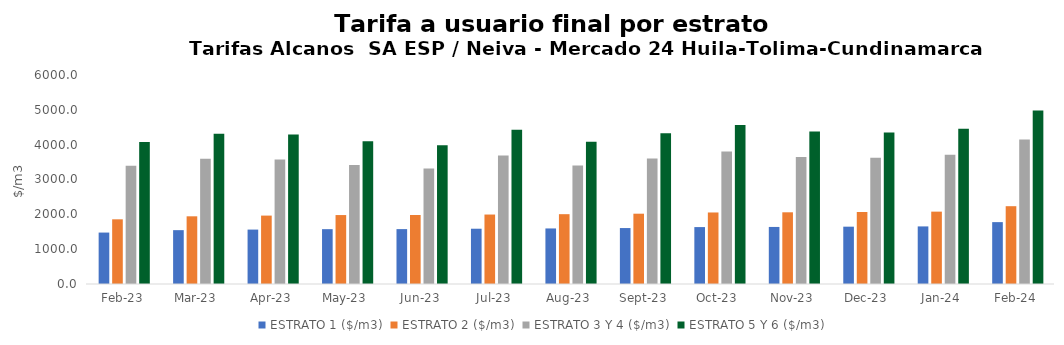
| Category | ESTRATO 1 ($/m3) | ESTRATO 2 ($/m3) | ESTRATO 3 Y 4 ($/m3) | ESTRATO 5 Y 6 ($/m3) |
|---|---|---|---|---|
| 2023-02-01 | 1476.55 | 1857.05 | 3398.26 | 4077.912 |
| 2023-03-01 | 1545.84 | 1943.33 | 3596.1 | 4315.32 |
| 2023-04-01 | 1562.23 | 1963.79 | 3575.22 | 4290.264 |
| 2023-05-01 | 1574.25 | 1979.21 | 3416.65 | 4099.98 |
| 2023-06-01 | 1575.71 | 1980.83 | 3316.57 | 3979.884 |
| 2023-07-01 | 1586.9 | 1994.23 | 3689.81 | 4427.772 |
| 2023-08-01 | 1594.84 | 2004.4 | 3401.48 | 4081.776 |
| 2023-09-01 | 1606 | 2018.25 | 3603.59 | 4324.308 |
| 2023-10-01 | 1634.07 | 2053.24 | 3805.44 | 4566.528 |
| 2023-11-01 | 1638.05 | 2058.35 | 3648.51 | 4378.212 |
| 2023-12-01 | 1645.74 | 2067.85 | 3624.28 | 4349.136 |
| 2024-01-01 | 1653.34 | 2077.37 | 3712.73 | 4455.276 |
| 2024-02-01 | 1776.31 | 2233.64 | 4149.96 | 4979.952 |